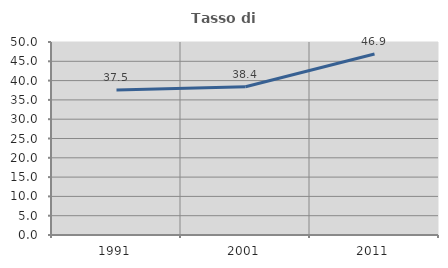
| Category | Tasso di occupazione   |
|---|---|
| 1991.0 | 37.541 |
| 2001.0 | 38.4 |
| 2011.0 | 46.895 |